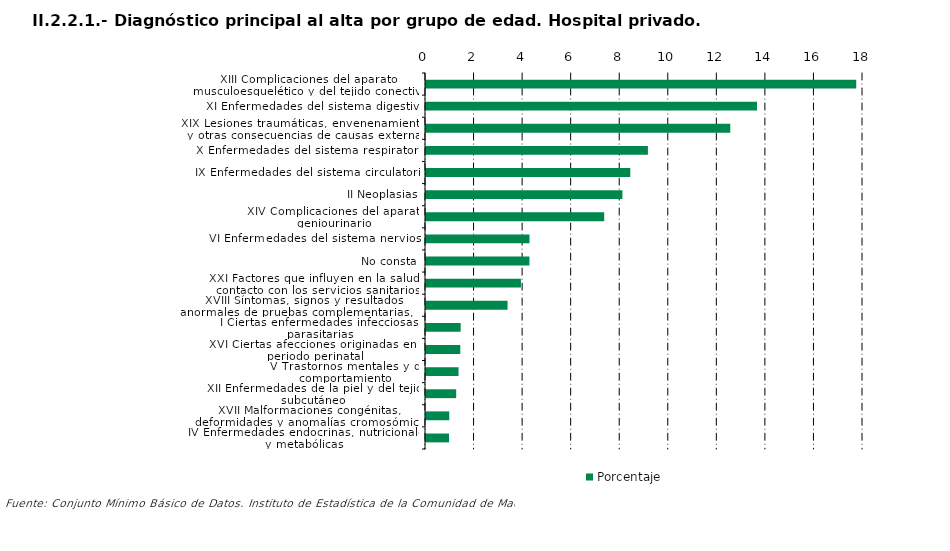
| Category | Porcentaje |
|---|---|
| XIII Complicaciones del aparato musculoesquelético y del tejido conectivo | 17.721 |
| XI Enfermedades del sistema digestivo | 13.634 |
| XIX Lesiones traumáticas, envenenamientos y otras consecuencias de causas externas | 12.533 |
| X Enfermedades del sistema respiratorio | 9.14 |
| IX Enfermedades del sistema circulatorio | 8.414 |
| II Neoplasias | 8.089 |
| XIV Complicaciones del aparato geniourinario | 7.34 |
| VI Enfermedades del sistema nervioso | 4.263 |
| No consta | 4.259 |
| XXI Factores que influyen en la salud y contacto con los servicios sanitarios | 3.91 |
| XVIII Síntomas, signos y resultados anormales de pruebas complementarias, no clasificados bajo otro concepto | 3.359 |
| I Ciertas enfermedades infecciosas y parasitarias | 1.428 |
| XVI Ciertas afecciones originadas en el periodo perinatal | 1.412 |
| V Trastornos mentales y de comportamiento | 1.34 |
| XII Enfermedades de la piel y del tejido subcutáneo | 1.243 |
| XVII Malformaciones congénitas, deformidades y anomalías cromosómicas | 0.957 |
| IV Enfermedades endocrinas, nutricionales y metabólicas | 0.949 |